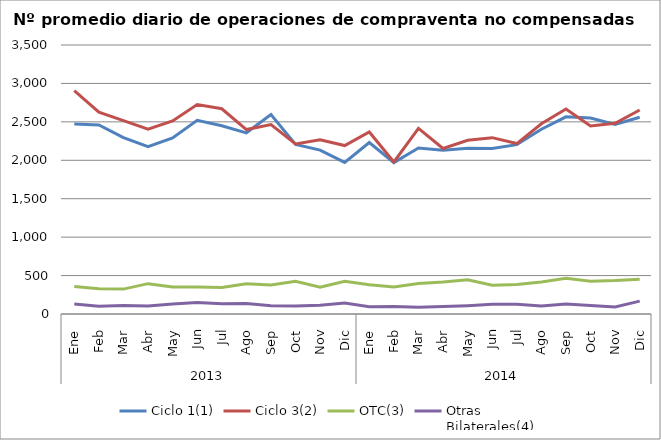
| Category | Ciclo 1(1) | Ciclo 3(2) | OTC(3) | Otras
Bilaterales(4) |
|---|---|---|---|---|
| 0 | 2472.091 | 2907.273 | 357.864 | 131.409 |
| 1 | 2459.8 | 2626.25 | 327.5 | 100.6 |
| 2 | 2294.6 | 2516 | 323.75 | 111.65 |
| 3 | 2176.182 | 2403.364 | 394.818 | 103.364 |
| 4 | 2290.048 | 2512.714 | 352.095 | 130.143 |
| 5 | 2520.75 | 2724.25 | 349.7 | 151.05 |
| 6 | 2449.045 | 2670.182 | 344.818 | 134.5 |
| 7 | 2357.333 | 2400.048 | 392.524 | 137.571 |
| 8 | 2593.778 | 2465 | 376.889 | 108.389 |
| 9 | 2205.955 | 2213.318 | 425.318 | 105.636 |
| 10 | 2132.1 | 2268.1 | 350 | 113.75 |
| 11 | 1972.35 | 2191.55 | 424.35 | 141.55 |
| 12 | 2231.227 | 2368.955 | 379.864 | 95 |
| 13 | 1969.85 | 1978.25 | 352.25 | 97.9 |
| 14 | 2160.619 | 2415.286 | 395.857 | 87.762 |
| 15 | 2130.667 | 2153.048 | 416.143 | 96 |
| 16 | 2155.9 | 2259.8 | 444.8 | 108.2 |
| 17 | 2153.571 | 2294.381 | 375.286 | 126.095 |
| 18 | 2203.545 | 2217.727 | 382.409 | 125.409 |
| 19 | 2404.35 | 2474.4 | 416.2 | 102.85 |
| 20 | 2565.8 | 2666.55 | 463.9 | 128.9 |
| 21 | 2551 | 2446.409 | 427.636 | 112.182 |
| 22 | 2467.1 | 2481.15 | 435.75 | 92.35 |
| 23 | 2560.1 | 2655 | 452.45 | 167.7 |